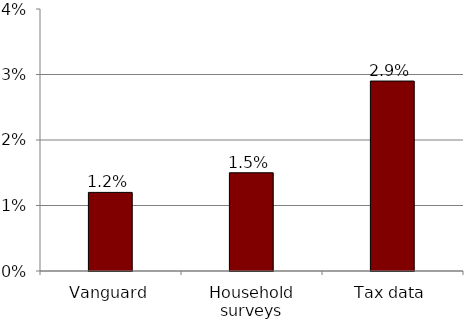
| Category | Series 0 |
|---|---|
| Vanguard | 0.012 |
| Household surveys | 0.015 |
| Tax data | 0.029 |